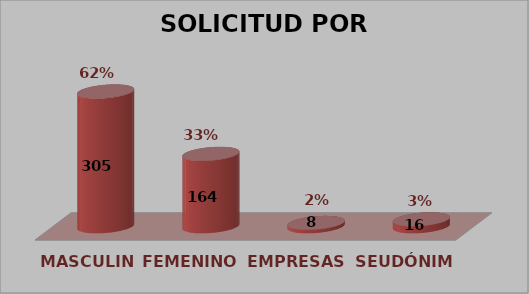
| Category | SOLICITUD POR GÉNERO | Series 1 |
|---|---|---|
| MASCULINO | 305 | 0.619 |
| FEMENINO | 164 | 0.333 |
| EMPRESAS | 8 | 0.016 |
| SEUDÓNIMO | 16 | 0.032 |